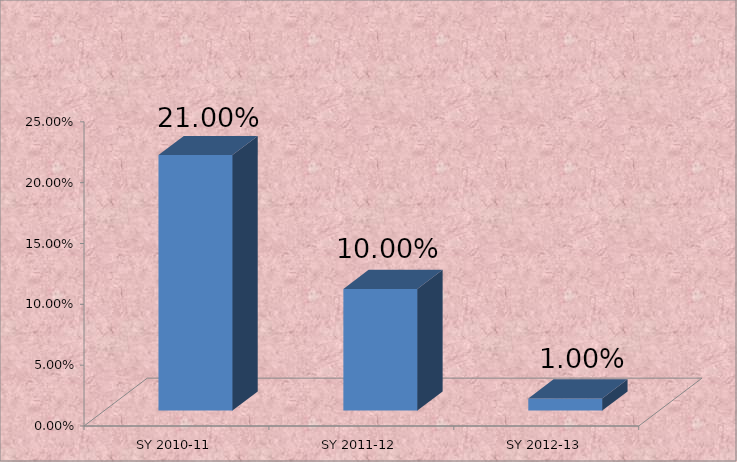
| Category | Series 0 |
|---|---|
| SY 2010-11 | 0.21 |
| SY 2011-12 | 0.1 |
| SY 2012-13 | 0.01 |